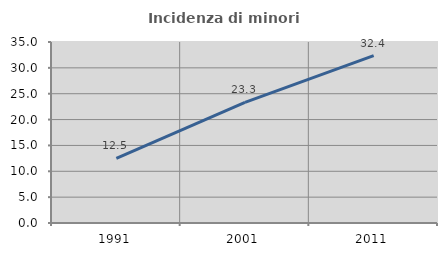
| Category | Incidenza di minori stranieri |
|---|---|
| 1991.0 | 12.5 |
| 2001.0 | 23.333 |
| 2011.0 | 32.361 |